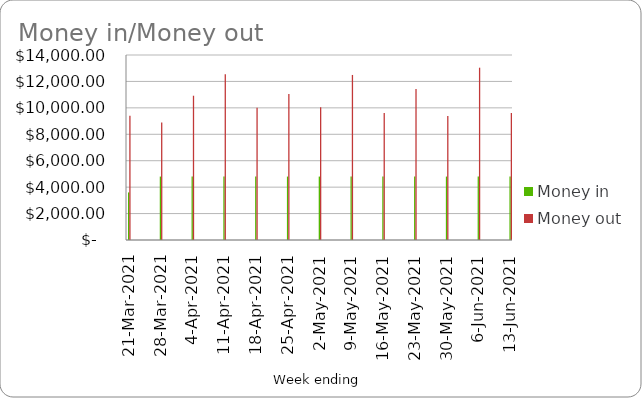
| Category | Money in | Money out |
|---|---|---|
| 2021-03-21 | 3600 | 9402.651 |
| 2021-03-28 | 4800 | 8883.788 |
| 2021-04-04 | 4800 | 10917.971 |
| 2021-04-11 | 4800 | 12537.788 |
| 2021-04-18 | 4800 | 10009.121 |
| 2021-04-25 | 4800 | 11043.788 |
| 2021-05-02 | 4800 | 10039.121 |
| 2021-05-09 | 4800 | 12489.788 |
| 2021-05-16 | 4800 | 9617.121 |
| 2021-05-23 | 4800 | 11435.788 |
| 2021-05-30 | 4800 | 9387.121 |
| 2021-06-06 | 4800 | 13039.788 |
| 2021-06-13 | 4800 | 9617.121 |